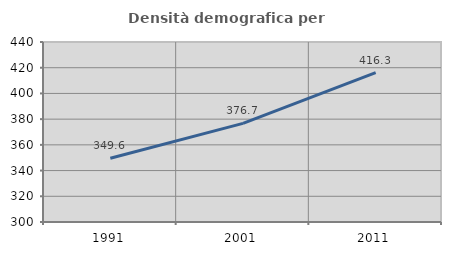
| Category | Densità demografica |
|---|---|
| 1991.0 | 349.603 |
| 2001.0 | 376.718 |
| 2011.0 | 416.253 |